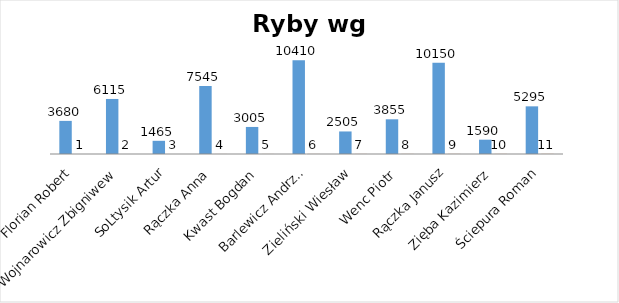
| Category | Series 0 | Series 1 |
|---|---|---|
| Florian Robert | 3680 | 1 |
| Wojnarowicz Zbigniwew | 6115 | 2 |
| SoLtysik Artur | 1465 | 3 |
| Rączka Anna | 7545 | 4 |
| Kwast Bogdan | 3005 | 5 |
| Barlewicz Andrzej | 10410 | 6 |
| Zieliński Wiesław | 2505 | 7 |
| Wenc Piotr | 3855 | 8 |
| Rączka Janusz | 10150 | 9 |
| Zięba Kazimierz | 1590 | 10 |
| Ściepura Roman | 5295 | 11 |